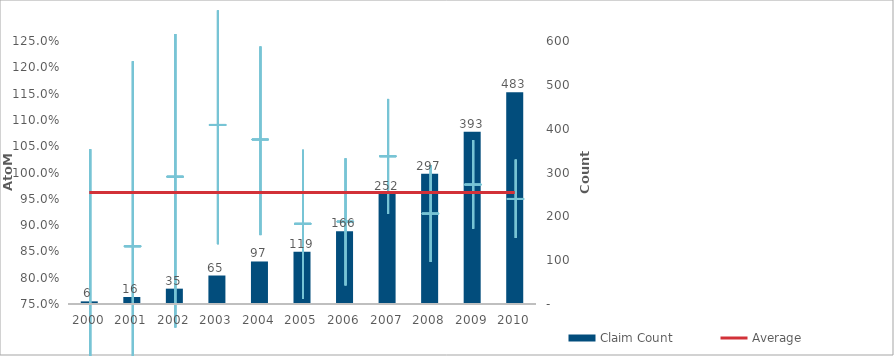
| Category | Claim Count |
|---|---|
| 0 | 6 |
| 1 | 16 |
| 2 | 35 |
| 3 | 65 |
| 4 | 97 |
| 5 | 119 |
| 6 | 166 |
| 7 | 252 |
| 8 | 297 |
| 9 | 393 |
| 10 | 483 |